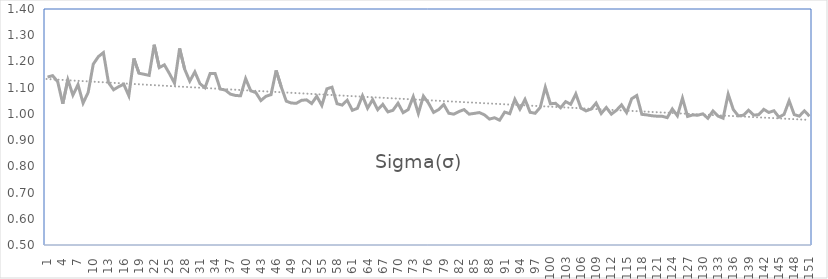
| Category | Sigma(σ) |
|---|---|
| 0 | 1.141 |
| 1 | 1.146 |
| 2 | 1.123 |
| 3 | 1.039 |
| 4 | 1.13 |
| 5 | 1.072 |
| 6 | 1.112 |
| 7 | 1.041 |
| 8 | 1.082 |
| 9 | 1.19 |
| 10 | 1.218 |
| 11 | 1.234 |
| 12 | 1.119 |
| 13 | 1.092 |
| 14 | 1.104 |
| 15 | 1.113 |
| 16 | 1.069 |
| 17 | 1.212 |
| 18 | 1.155 |
| 19 | 1.151 |
| 20 | 1.147 |
| 21 | 1.264 |
| 22 | 1.176 |
| 23 | 1.187 |
| 24 | 1.154 |
| 25 | 1.117 |
| 26 | 1.25 |
| 27 | 1.17 |
| 28 | 1.125 |
| 29 | 1.16 |
| 30 | 1.115 |
| 31 | 1.1 |
| 32 | 1.154 |
| 33 | 1.154 |
| 34 | 1.095 |
| 35 | 1.091 |
| 36 | 1.075 |
| 37 | 1.07 |
| 38 | 1.069 |
| 39 | 1.135 |
| 40 | 1.088 |
| 41 | 1.081 |
| 42 | 1.051 |
| 43 | 1.067 |
| 44 | 1.073 |
| 45 | 1.166 |
| 46 | 1.104 |
| 47 | 1.049 |
| 48 | 1.041 |
| 49 | 1.041 |
| 50 | 1.052 |
| 51 | 1.054 |
| 52 | 1.039 |
| 53 | 1.067 |
| 54 | 1.032 |
| 55 | 1.096 |
| 56 | 1.102 |
| 57 | 1.039 |
| 58 | 1.034 |
| 59 | 1.052 |
| 60 | 1.014 |
| 61 | 1.021 |
| 62 | 1.069 |
| 63 | 1.022 |
| 64 | 1.054 |
| 65 | 1.016 |
| 66 | 1.036 |
| 67 | 1.008 |
| 68 | 1.014 |
| 69 | 1.041 |
| 70 | 1.005 |
| 71 | 1.016 |
| 72 | 1.066 |
| 73 | 1.002 |
| 74 | 1.068 |
| 75 | 1.041 |
| 76 | 1.006 |
| 77 | 1.016 |
| 78 | 1.036 |
| 79 | 1.002 |
| 80 | 0.999 |
| 81 | 1.009 |
| 82 | 1.016 |
| 83 | 0.999 |
| 84 | 1.002 |
| 85 | 1.005 |
| 86 | 0.997 |
| 87 | 0.98 |
| 88 | 0.985 |
| 89 | 0.976 |
| 90 | 1.007 |
| 91 | 1.001 |
| 92 | 1.056 |
| 93 | 1.018 |
| 94 | 1.055 |
| 95 | 1.006 |
| 96 | 1.002 |
| 97 | 1.025 |
| 98 | 1.102 |
| 99 | 1.038 |
| 100 | 1.04 |
| 101 | 1.023 |
| 102 | 1.047 |
| 103 | 1.037 |
| 104 | 1.076 |
| 105 | 1.022 |
| 106 | 1.011 |
| 107 | 1.018 |
| 108 | 1.041 |
| 109 | 1.001 |
| 110 | 1.024 |
| 111 | 0.999 |
| 112 | 1.014 |
| 113 | 1.034 |
| 114 | 1.005 |
| 115 | 1.058 |
| 116 | 1.07 |
| 117 | 0.998 |
| 118 | 0.996 |
| 119 | 0.993 |
| 120 | 0.991 |
| 121 | 0.991 |
| 122 | 0.986 |
| 123 | 1.019 |
| 124 | 0.993 |
| 125 | 1.06 |
| 126 | 0.99 |
| 127 | 0.996 |
| 128 | 0.995 |
| 129 | 1 |
| 130 | 0.983 |
| 131 | 1.011 |
| 132 | 0.992 |
| 133 | 0.984 |
| 134 | 1.075 |
| 135 | 1.017 |
| 136 | 0.992 |
| 137 | 0.995 |
| 138 | 1.014 |
| 139 | 0.995 |
| 140 | 0.997 |
| 141 | 1.017 |
| 142 | 1.005 |
| 143 | 1.012 |
| 144 | 0.987 |
| 145 | 0.998 |
| 146 | 1.05 |
| 147 | 0.997 |
| 148 | 0.991 |
| 149 | 1.012 |
| 150 | 0.991 |